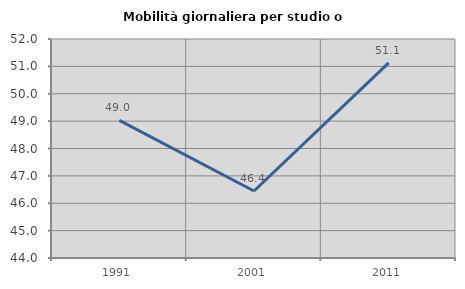
| Category | Mobilità giornaliera per studio o lavoro |
|---|---|
| 1991.0 | 49.028 |
| 2001.0 | 46.446 |
| 2011.0 | 51.126 |